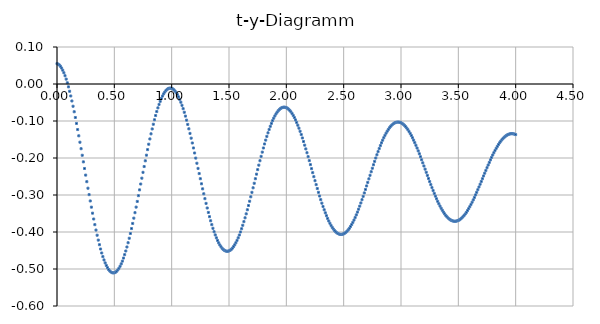
| Category | Series 0 |
|---|---|
| 0.0 | 0.055 |
| 0.01 | 0.054 |
| 0.02 | 0.051 |
| 0.03 | 0.048 |
| 0.04 | 0.043 |
| 0.05 | 0.037 |
| 0.06 | 0.03 |
| 0.07 | 0.022 |
| 0.08 | 0.013 |
| 0.09 | 0.003 |
| 0.1 | -0.008 |
| 0.11 | -0.02 |
| 0.12 | -0.032 |
| 0.13 | -0.046 |
| 0.14 | -0.06 |
| 0.15 | -0.075 |
| 0.16 | -0.091 |
| 0.17 | -0.107 |
| 0.18 | -0.123 |
| 0.19 | -0.14 |
| 0.2 | -0.157 |
| 0.21 | -0.175 |
| 0.22 | -0.193 |
| 0.23 | -0.21 |
| 0.24 | -0.228 |
| 0.25 | -0.246 |
| 0.26 | -0.264 |
| 0.27 | -0.282 |
| 0.28 | -0.299 |
| 0.29 | -0.316 |
| 0.3 | -0.333 |
| 0.31 | -0.349 |
| 0.32 | -0.365 |
| 0.33 | -0.38 |
| 0.34 | -0.395 |
| 0.35 | -0.409 |
| 0.36 | -0.422 |
| 0.37 | -0.434 |
| 0.38 | -0.446 |
| 0.39 | -0.457 |
| 0.4 | -0.467 |
| 0.41 | -0.476 |
| 0.42 | -0.484 |
| 0.43 | -0.49 |
| 0.44 | -0.496 |
| 0.45 | -0.501 |
| 0.46 | -0.505 |
| 0.47 | -0.508 |
| 0.48 | -0.51 |
| 0.49 | -0.51 |
| 0.5 | -0.51 |
| 0.51 | -0.509 |
| 0.52 | -0.506 |
| 0.53 | -0.503 |
| 0.54 | -0.498 |
| 0.55 | -0.493 |
| 0.56 | -0.486 |
| 0.57 | -0.479 |
| 0.58 | -0.47 |
| 0.59 | -0.461 |
| 0.6 | -0.451 |
| 0.61 | -0.441 |
| 0.62 | -0.429 |
| 0.63 | -0.417 |
| 0.64 | -0.404 |
| 0.65 | -0.391 |
| 0.66 | -0.377 |
| 0.67 | -0.363 |
| 0.68 | -0.348 |
| 0.69 | -0.333 |
| 0.7 | -0.317 |
| 0.71 | -0.302 |
| 0.72 | -0.286 |
| 0.73 | -0.27 |
| 0.74 | -0.255 |
| 0.75 | -0.239 |
| 0.76 | -0.223 |
| 0.77 | -0.208 |
| 0.78 | -0.192 |
| 0.790000000000001 | -0.177 |
| 0.8 | -0.163 |
| 0.810000000000001 | -0.148 |
| 0.82 | -0.135 |
| 0.83 | -0.121 |
| 0.84 | -0.109 |
| 0.850000000000001 | -0.097 |
| 0.860000000000001 | -0.085 |
| 0.87 | -0.075 |
| 0.88 | -0.065 |
| 0.890000000000001 | -0.055 |
| 0.900000000000001 | -0.047 |
| 0.910000000000001 | -0.039 |
| 0.92 | -0.033 |
| 0.930000000000001 | -0.027 |
| 0.940000000000001 | -0.022 |
| 0.950000000000001 | -0.018 |
| 0.960000000000001 | -0.015 |
| 0.970000000000001 | -0.013 |
| 0.980000000000001 | -0.011 |
| 0.990000000000001 | -0.011 |
| 1.0 | -0.012 |
| 1.01 | -0.013 |
| 1.02 | -0.016 |
| 1.03 | -0.019 |
| 1.04 | -0.024 |
| 1.05 | -0.029 |
| 1.06 | -0.035 |
| 1.07 | -0.042 |
| 1.08 | -0.049 |
| 1.09 | -0.058 |
| 1.1 | -0.067 |
| 1.11 | -0.076 |
| 1.12 | -0.087 |
| 1.13 | -0.098 |
| 1.14 | -0.109 |
| 1.15 | -0.121 |
| 1.16 | -0.134 |
| 1.17 | -0.146 |
| 1.18 | -0.159 |
| 1.19 | -0.173 |
| 1.2 | -0.186 |
| 1.21 | -0.2 |
| 1.22 | -0.214 |
| 1.23 | -0.228 |
| 1.24 | -0.242 |
| 1.25 | -0.256 |
| 1.26 | -0.27 |
| 1.27 | -0.283 |
| 1.28 | -0.297 |
| 1.29 | -0.31 |
| 1.3 | -0.323 |
| 1.31 | -0.335 |
| 1.32 | -0.347 |
| 1.33 | -0.359 |
| 1.34 | -0.37 |
| 1.35 | -0.38 |
| 1.36 | -0.39 |
| 1.37 | -0.399 |
| 1.38 | -0.408 |
| 1.39 | -0.416 |
| 1.4 | -0.423 |
| 1.41 | -0.429 |
| 1.42 | -0.435 |
| 1.43 | -0.44 |
| 1.44 | -0.444 |
| 1.45 | -0.447 |
| 1.46 | -0.45 |
| 1.47 | -0.451 |
| 1.48 | -0.452 |
| 1.49 | -0.452 |
| 1.5 | -0.451 |
| 1.51 | -0.449 |
| 1.52 | -0.447 |
| 1.53 | -0.444 |
| 1.54 | -0.439 |
| 1.55 | -0.435 |
| 1.56 | -0.429 |
| 1.57 | -0.423 |
| 1.58 | -0.416 |
| 1.59 | -0.408 |
| 1.6 | -0.4 |
| 1.61 | -0.391 |
| 1.62 | -0.382 |
| 1.63 | -0.372 |
| 1.64 | -0.362 |
| 1.65 | -0.351 |
| 1.66 | -0.34 |
| 1.67 | -0.328 |
| 1.68 | -0.317 |
| 1.69 | -0.305 |
| 1.7 | -0.293 |
| 1.71 | -0.281 |
| 1.72 | -0.268 |
| 1.73 | -0.256 |
| 1.74 | -0.244 |
| 1.75 | -0.231 |
| 1.76 | -0.219 |
| 1.77 | -0.207 |
| 1.78 | -0.196 |
| 1.79 | -0.184 |
| 1.8 | -0.173 |
| 1.81 | -0.162 |
| 1.82 | -0.152 |
| 1.83 | -0.142 |
| 1.84 | -0.132 |
| 1.85 | -0.123 |
| 1.86 | -0.114 |
| 1.87 | -0.106 |
| 1.88 | -0.099 |
| 1.89 | -0.092 |
| 1.9 | -0.086 |
| 1.91 | -0.081 |
| 1.92 | -0.076 |
| 1.93 | -0.072 |
| 1.94 | -0.069 |
| 1.95 | -0.066 |
| 1.96 | -0.064 |
| 1.97 | -0.063 |
| 1.98 | -0.063 |
| 1.99 | -0.063 |
| 2.0 | -0.064 |
| 2.01 | -0.066 |
| 2.02 | -0.068 |
| 2.03 | -0.071 |
| 2.04 | -0.075 |
| 2.05 | -0.08 |
| 2.06 | -0.085 |
| 2.07 | -0.091 |
| 2.08 | -0.097 |
| 2.09 | -0.104 |
| 2.1 | -0.111 |
| 2.11 | -0.119 |
| 2.12 | -0.128 |
| 2.13 | -0.137 |
| 2.14 | -0.146 |
| 2.15 | -0.155 |
| 2.16 | -0.165 |
| 2.17 | -0.175 |
| 2.18 | -0.186 |
| 2.19 | -0.196 |
| 2.2 | -0.207 |
| 2.21 | -0.218 |
| 2.22 | -0.229 |
| 2.23 | -0.24 |
| 2.24 | -0.251 |
| 2.25 | -0.261 |
| 2.25999999999999 | -0.272 |
| 2.26999999999999 | -0.282 |
| 2.27999999999999 | -0.293 |
| 2.28999999999999 | -0.303 |
| 2.29999999999999 | -0.313 |
| 2.30999999999999 | -0.322 |
| 2.31999999999999 | -0.331 |
| 2.32999999999999 | -0.34 |
| 2.33999999999999 | -0.348 |
| 2.34999999999999 | -0.356 |
| 2.35999999999999 | -0.363 |
| 2.36999999999999 | -0.37 |
| 2.37999999999999 | -0.377 |
| 2.38999999999999 | -0.382 |
| 2.39999999999999 | -0.387 |
| 2.40999999999999 | -0.392 |
| 2.41999999999999 | -0.396 |
| 2.42999999999999 | -0.399 |
| 2.43999999999999 | -0.402 |
| 2.44999999999999 | -0.404 |
| 2.45999999999999 | -0.406 |
| 2.46999999999999 | -0.406 |
| 2.47999999999999 | -0.406 |
| 2.48999999999999 | -0.406 |
| 2.49999999999999 | -0.405 |
| 2.50999999999999 | -0.403 |
| 2.51999999999999 | -0.401 |
| 2.52999999999999 | -0.398 |
| 2.53999999999999 | -0.394 |
| 2.54999999999999 | -0.39 |
| 2.55999999999999 | -0.385 |
| 2.56999999999999 | -0.38 |
| 2.57999999999999 | -0.374 |
| 2.58999999999999 | -0.368 |
| 2.59999999999999 | -0.361 |
| 2.60999999999999 | -0.354 |
| 2.61999999999999 | -0.346 |
| 2.62999999999999 | -0.338 |
| 2.63999999999999 | -0.33 |
| 2.64999999999999 | -0.321 |
| 2.65999999999999 | -0.313 |
| 2.66999999999999 | -0.304 |
| 2.67999999999999 | -0.294 |
| 2.68999999999999 | -0.285 |
| 2.69999999999999 | -0.275 |
| 2.70999999999999 | -0.266 |
| 2.71999999999998 | -0.256 |
| 2.72999999999998 | -0.247 |
| 2.73999999999998 | -0.237 |
| 2.74999999999998 | -0.228 |
| 2.75999999999998 | -0.218 |
| 2.76999999999998 | -0.209 |
| 2.77999999999998 | -0.2 |
| 2.78999999999998 | -0.191 |
| 2.79999999999998 | -0.183 |
| 2.80999999999998 | -0.175 |
| 2.81999999999998 | -0.167 |
| 2.82999999999998 | -0.159 |
| 2.83999999999998 | -0.152 |
| 2.84999999999998 | -0.145 |
| 2.85999999999998 | -0.139 |
| 2.86999999999998 | -0.133 |
| 2.87999999999998 | -0.127 |
| 2.88999999999998 | -0.123 |
| 2.89999999999998 | -0.118 |
| 2.90999999999998 | -0.114 |
| 2.91999999999998 | -0.111 |
| 2.92999999999998 | -0.108 |
| 2.93999999999998 | -0.106 |
| 2.94999999999998 | -0.104 |
| 2.95999999999998 | -0.103 |
| 2.96999999999998 | -0.103 |
| 2.97999999999998 | -0.103 |
| 2.98999999999998 | -0.104 |
| 2.99999999999998 | -0.105 |
| 3.00999999999998 | -0.107 |
| 3.01999999999998 | -0.109 |
| 3.02999999999998 | -0.112 |
| 3.03999999999998 | -0.115 |
| 3.04999999999998 | -0.119 |
| 3.05999999999998 | -0.123 |
| 3.06999999999998 | -0.128 |
| 3.07999999999998 | -0.134 |
| 3.08999999999998 | -0.139 |
| 3.09999999999998 | -0.145 |
| 3.10999999999998 | -0.152 |
| 3.11999999999998 | -0.159 |
| 3.12999999999998 | -0.166 |
| 3.13999999999998 | -0.173 |
| 3.14999999999998 | -0.181 |
| 3.15999999999998 | -0.189 |
| 3.16999999999998 | -0.197 |
| 3.17999999999998 | -0.205 |
| 3.18999999999997 | -0.213 |
| 3.19999999999997 | -0.222 |
| 3.20999999999997 | -0.23 |
| 3.21999999999997 | -0.239 |
| 3.22999999999997 | -0.247 |
| 3.23999999999997 | -0.255 |
| 3.24999999999997 | -0.264 |
| 3.25999999999997 | -0.272 |
| 3.26999999999997 | -0.28 |
| 3.27999999999997 | -0.288 |
| 3.28999999999997 | -0.296 |
| 3.29999999999997 | -0.303 |
| 3.30999999999997 | -0.31 |
| 3.31999999999997 | -0.317 |
| 3.32999999999997 | -0.324 |
| 3.33999999999997 | -0.33 |
| 3.34999999999997 | -0.336 |
| 3.35999999999997 | -0.341 |
| 3.36999999999997 | -0.346 |
| 3.37999999999997 | -0.351 |
| 3.38999999999997 | -0.355 |
| 3.39999999999997 | -0.359 |
| 3.40999999999997 | -0.362 |
| 3.41999999999997 | -0.365 |
| 3.42999999999997 | -0.367 |
| 3.43999999999997 | -0.369 |
| 3.44999999999997 | -0.37 |
| 3.45999999999997 | -0.371 |
| 3.46999999999997 | -0.371 |
| 3.47999999999997 | -0.371 |
| 3.48999999999997 | -0.37 |
| 3.49999999999997 | -0.369 |
| 3.50999999999997 | -0.367 |
| 3.51999999999997 | -0.365 |
| 3.52999999999997 | -0.362 |
| 3.53999999999997 | -0.359 |
| 3.54999999999997 | -0.355 |
| 3.55999999999997 | -0.351 |
| 3.56999999999997 | -0.347 |
| 3.57999999999997 | -0.342 |
| 3.58999999999997 | -0.337 |
| 3.59999999999997 | -0.332 |
| 3.60999999999997 | -0.326 |
| 3.61999999999997 | -0.32 |
| 3.62999999999997 | -0.313 |
| 3.63999999999997 | -0.307 |
| 3.64999999999997 | -0.3 |
| 3.65999999999996 | -0.293 |
| 3.66999999999996 | -0.286 |
| 3.67999999999996 | -0.278 |
| 3.68999999999996 | -0.271 |
| 3.69999999999996 | -0.263 |
| 3.70999999999996 | -0.256 |
| 3.71999999999996 | -0.249 |
| 3.72999999999996 | -0.241 |
| 3.73999999999996 | -0.234 |
| 3.74999999999996 | -0.226 |
| 3.75999999999996 | -0.219 |
| 3.76999999999996 | -0.212 |
| 3.77999999999996 | -0.205 |
| 3.78999999999996 | -0.198 |
| 3.79999999999996 | -0.192 |
| 3.80999999999996 | -0.186 |
| 3.81999999999996 | -0.18 |
| 3.82999999999996 | -0.174 |
| 3.83999999999996 | -0.169 |
| 3.84999999999996 | -0.164 |
| 3.85999999999996 | -0.159 |
| 3.86999999999996 | -0.155 |
| 3.87999999999996 | -0.151 |
| 3.88999999999996 | -0.147 |
| 3.89999999999996 | -0.144 |
| 3.90999999999996 | -0.141 |
| 3.91999999999996 | -0.139 |
| 3.92999999999996 | -0.137 |
| 3.93999999999996 | -0.136 |
| 3.94999999999996 | -0.135 |
| 3.95999999999996 | -0.134 |
| 3.96999999999996 | -0.134 |
| 3.97999999999996 | -0.135 |
| 3.98999999999996 | -0.135 |
| 3.99999999999996 | -0.137 |